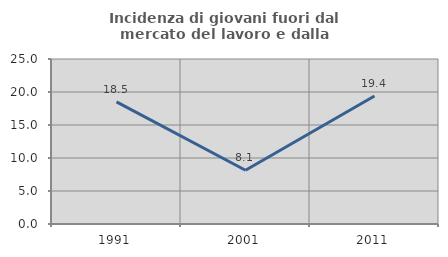
| Category | Incidenza di giovani fuori dal mercato del lavoro e dalla formazione  |
|---|---|
| 1991.0 | 18.506 |
| 2001.0 | 8.14 |
| 2011.0 | 19.388 |